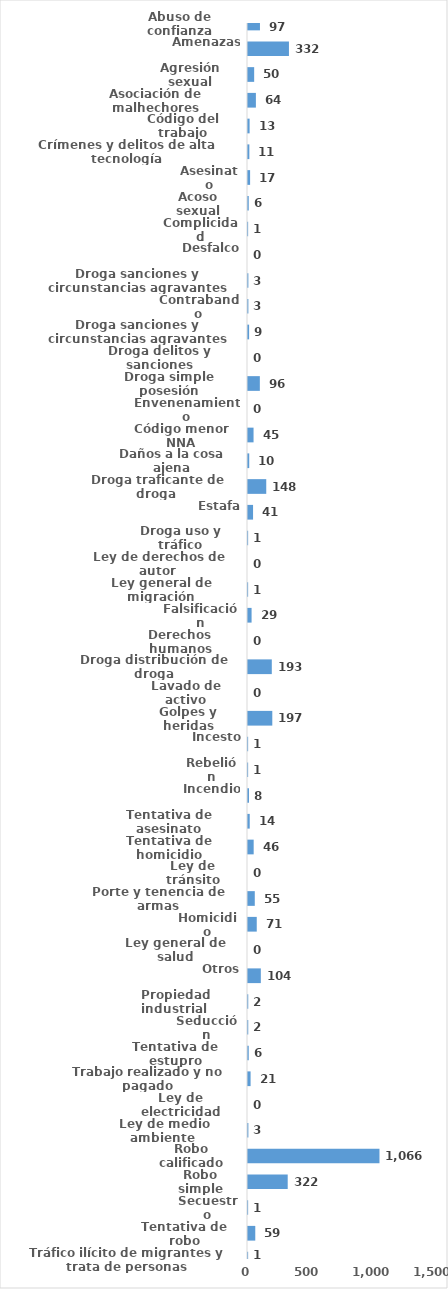
| Category | Series 0 |
|---|---|
| Abuso de confianza | 97 |
| Amenazas | 332 |
| Agresión sexual | 50 |
| Asociación de malhechores | 64 |
| Código del trabajo | 13 |
| Crímenes y delitos de alta tecnología | 11 |
| Asesinato | 17 |
| Acoso sexual | 6 |
| Complicidad | 1 |
| Desfalco | 0 |
| Droga sanciones y circunstancias agravantes | 3 |
| Contrabando | 3 |
| Droga sanciones y circunstancias agravantes | 9 |
| Droga delitos y sanciones | 0 |
| Droga simple posesión | 96 |
| Envenenamiento | 0 |
| Código menor NNA | 45 |
| Daños a la cosa ajena | 10 |
| Droga traficante de droga  | 148 |
| Estafa | 41 |
| Droga uso y tráfico | 1 |
| Ley de derechos de autor  | 0 |
| Ley general de migración | 1 |
| Falsificación | 29 |
| Derechos humanos | 0 |
| Droga distribución de droga | 193 |
| Lavado de activo | 0 |
| Golpes y heridas | 197 |
| Incesto | 1 |
| Rebelión | 1 |
| Incendio | 8 |
| Tentativa de asesinato | 14 |
| Tentativa de homicidio | 46 |
| Ley de tránsito | 0 |
| Porte y tenencia de armas | 55 |
| Homicidio | 71 |
| Ley general de salud | 0 |
| Otros | 104 |
| Propiedad industrial  | 2 |
| Seducción | 2 |
| Tentativa de estupro | 6 |
| Trabajo realizado y no pagado | 21 |
| Ley de electricidad | 0 |
| Ley de medio ambiente  | 3 |
| Robo calificado | 1066 |
| Robo simple | 322 |
| Secuestro | 1 |
| Tentativa de robo | 59 |
| Tráfico ilícito de migrantes y trata de personas | 1 |